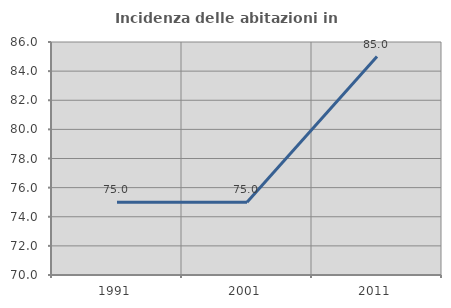
| Category | Incidenza delle abitazioni in proprietà  |
|---|---|
| 1991.0 | 75 |
| 2001.0 | 75 |
| 2011.0 | 85 |